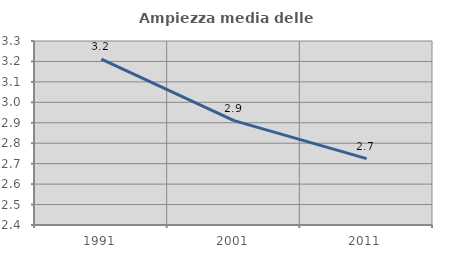
| Category | Ampiezza media delle famiglie |
|---|---|
| 1991.0 | 3.211 |
| 2001.0 | 2.91 |
| 2011.0 | 2.725 |